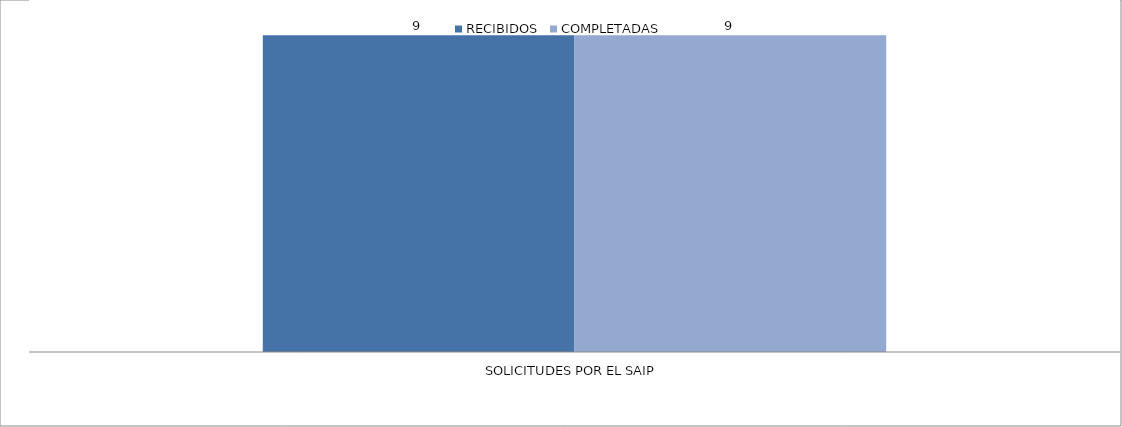
| Category | RECIBIDOS | COMPLETADAS |
|---|---|---|
| SOLICITUDES POR EL SAIP | 9 | 9 |